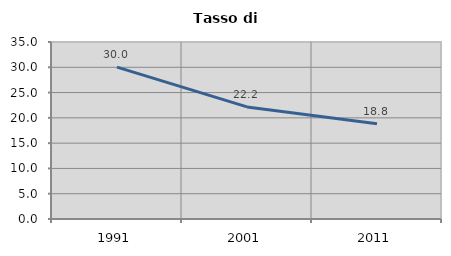
| Category | Tasso di disoccupazione   |
|---|---|
| 1991.0 | 30.027 |
| 2001.0 | 22.165 |
| 2011.0 | 18.834 |